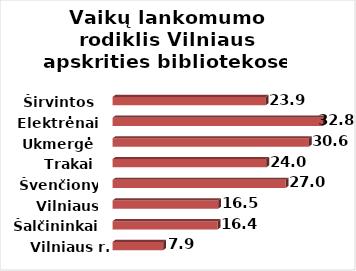
| Category | Series 0 |
|---|---|
| Vilniaus r. | 7.89 |
| Šalčininkai | 16.36 |
| Vilniaus m. | 16.45 |
| Švenčionys | 26.95 |
| Trakai | 23.95 |
| Ukmergė | 30.56 |
| Elektrėnai | 32.77 |
| Širvintos | 23.86 |